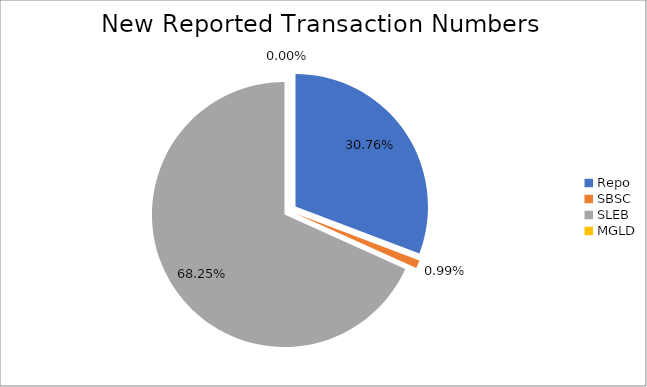
| Category | Series 0 |
|---|---|
| Repo | 310151 |
| SBSC | 10016 |
| SLEB | 688211 |
| MGLD | 7 |